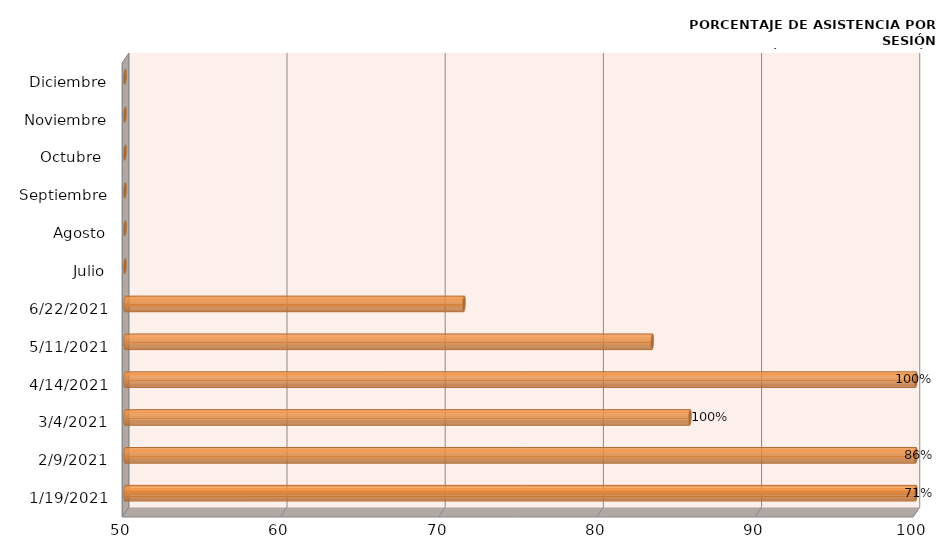
| Category | Series 0 |
|---|---|
| 19/01/2021 | 100 |
| 09/02/2021 | 100 |
| 04/03/2021 | 85.714 |
| 14/04/2021 | 100 |
| 11/05/2021 | 83.333 |
| 22/06/2021 | 71.429 |
| Julio | 0 |
| Agosto | 0 |
| Septiembre | 0 |
| Octubre  | 0 |
| Noviembre | 0 |
| Diciembre | 0 |